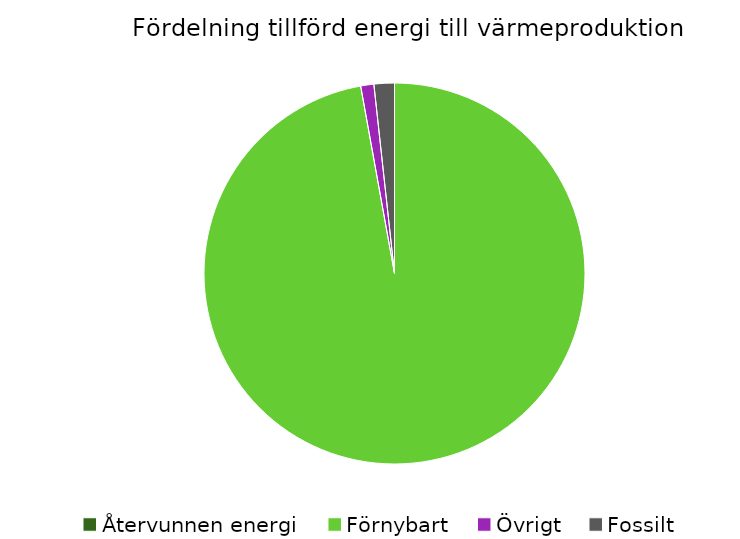
| Category | Fördelning värmeproduktion |
|---|---|
| Återvunnen energi | 0 |
| Förnybart | 0.972 |
| Övrigt | 0.011 |
| Fossilt | 0.017 |